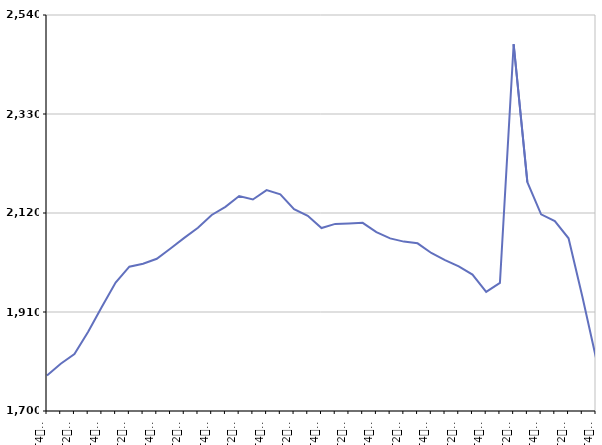
| Category | De 25 à 49 ans |
|---|---|
| T4
2011 | 1775.3 |
| T1
2012 | 1800.4 |
| T2
2012 | 1820.8 |
| T3
2012 | 1867.9 |
| T4
2012 | 1921.1 |
| T1
2013 | 1972.3 |
| T2
2013 | 2006.1 |
| T3
2013 | 2012.4 |
| T4
2013 | 2022.9 |
| T1
2014 | 2044.7 |
| T2
2014 | 2067.2 |
| T3
2014 | 2088.5 |
| T4
2014 | 2115.8 |
| T1
2015 | 2133 |
| T2
2015 | 2156 |
| T3
2015 | 2148.7 |
| T4
2015 | 2168.5 |
| T1
2016 | 2159.6 |
| T2
2016 | 2128 |
| T3
2016 | 2114.1 |
| T4
2016 | 2088.1 |
| T1
2017 | 2096.9 |
| T2
2017 | 2097.9 |
| T3
2017 | 2099.2 |
| T4
2017 | 2079.5 |
| T1
2018 | 2066.1 |
| T2
2018 | 2059.3 |
| T3
2018 | 2055.7 |
| T4
2018 | 2035.2 |
| T1
2019 | 2020.1 |
| T2
2019 | 2006.6 |
| T3
2019 | 1989.3 |
| T4
2019 | 1952.6 |
| T1
2020 | 1971.6 |
| T2
2020 | 2478 |
| T3
2020 | 2185.2 |
| T4
2020 | 2117.2 |
| T1
2021 | 2102.8 |
| T2
2021 | 2066.3 |
| T3
2021 | 1943.5 |
| T4
2021 | 1812.9 |